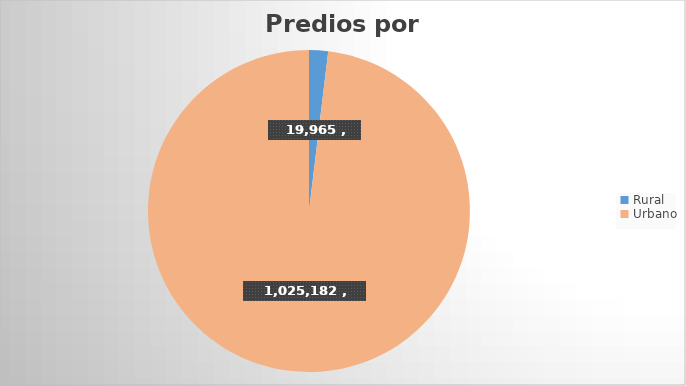
| Category | Predios |
|---|---|
| Rural | 19965 |
| Urbano | 1025182 |